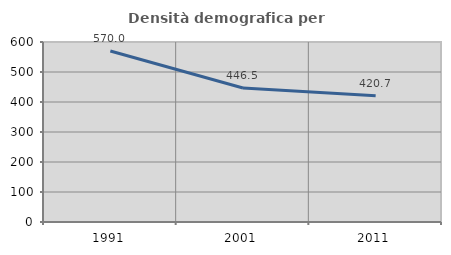
| Category | Densità demografica |
|---|---|
| 1991.0 | 570.015 |
| 2001.0 | 446.512 |
| 2011.0 | 420.726 |